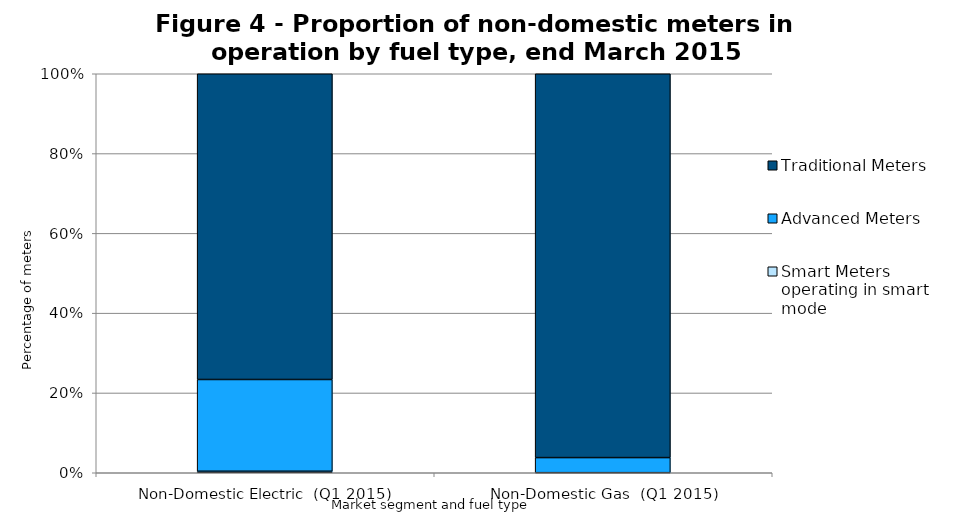
| Category | Smart Meters operating in smart mode | Advanced Meters | Traditional Meters |
|---|---|---|---|
| Non-Domestic Electric  (Q1 2015) | 8331 | 509224 | 1696853 |
| Non-Domestic Gas  (Q1 2015) | 95 | 18587 | 472710 |